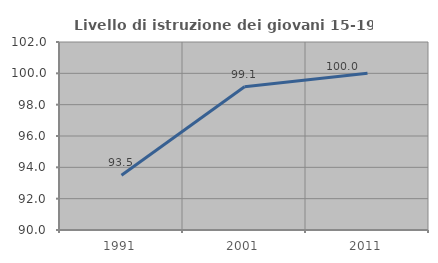
| Category | Livello di istruzione dei giovani 15-19 anni |
|---|---|
| 1991.0 | 93.5 |
| 2001.0 | 99.145 |
| 2011.0 | 100 |